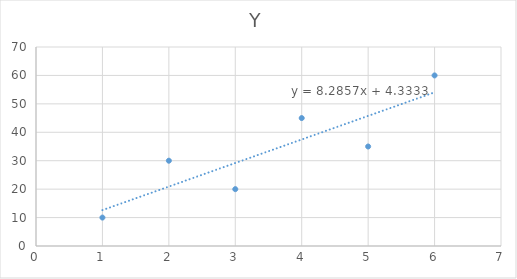
| Category | Y |
|---|---|
| 1.0 | 10 |
| 2.0 | 30 |
| 3.0 | 20 |
| 4.0 | 45 |
| 5.0 | 35 |
| 6.0 | 60 |